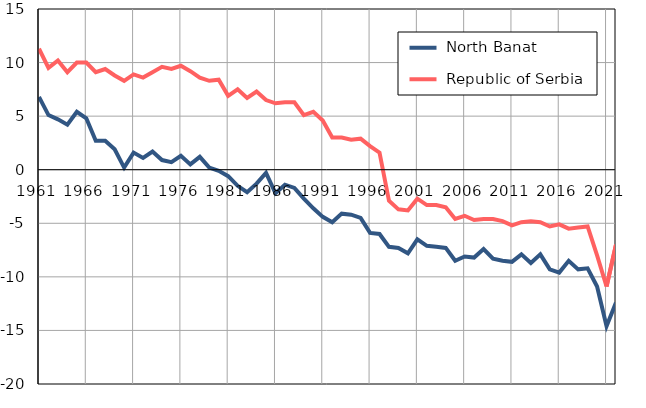
| Category |  North Banat |  Republic of Serbia |
|---|---|---|
| 1961.0 | 6.8 | 11.3 |
| 1962.0 | 5.1 | 9.5 |
| 1963.0 | 4.7 | 10.2 |
| 1964.0 | 4.2 | 9.1 |
| 1965.0 | 5.4 | 10 |
| 1966.0 | 4.8 | 10 |
| 1967.0 | 2.7 | 9.1 |
| 1968.0 | 2.7 | 9.4 |
| 1969.0 | 1.9 | 8.8 |
| 1970.0 | 0.2 | 8.3 |
| 1971.0 | 1.6 | 8.9 |
| 1972.0 | 1.1 | 8.6 |
| 1973.0 | 1.7 | 9.1 |
| 1974.0 | 0.9 | 9.6 |
| 1975.0 | 0.7 | 9.4 |
| 1976.0 | 1.3 | 9.7 |
| 1977.0 | 0.5 | 9.2 |
| 1978.0 | 1.2 | 8.6 |
| 1979.0 | 0.2 | 8.3 |
| 1980.0 | -0.1 | 8.4 |
| 1981.0 | -0.6 | 6.9 |
| 1982.0 | -1.5 | 7.5 |
| 1983.0 | -2.1 | 6.7 |
| 1984.0 | -1.3 | 7.3 |
| 1985.0 | -0.3 | 6.5 |
| 1986.0 | -2.2 | 6.2 |
| 1987.0 | -1.4 | 6.3 |
| 1988.0 | -1.7 | 6.3 |
| 1989.0 | -2.7 | 5.1 |
| 1990.0 | -3.6 | 5.4 |
| 1991.0 | -4.4 | 4.6 |
| 1992.0 | -4.9 | 3 |
| 1993.0 | -4.1 | 3 |
| 1994.0 | -4.2 | 2.8 |
| 1995.0 | -4.5 | 2.9 |
| 1996.0 | -5.9 | 2.2 |
| 1997.0 | -6 | 1.6 |
| 1998.0 | -7.2 | -2.9 |
| 1999.0 | -7.3 | -3.7 |
| 2000.0 | -7.8 | -3.8 |
| 2001.0 | -6.5 | -2.7 |
| 2002.0 | -7.1 | -3.3 |
| 2003.0 | -7.2 | -3.3 |
| 2004.0 | -7.3 | -3.5 |
| 2005.0 | -8.5 | -4.6 |
| 2006.0 | -8.1 | -4.3 |
| 2007.0 | -8.2 | -4.7 |
| 2008.0 | -7.4 | -4.6 |
| 2009.0 | -8.3 | -4.6 |
| 2010.0 | -8.5 | -4.8 |
| 2011.0 | -8.6 | -5.2 |
| 2012.0 | -7.9 | -4.9 |
| 2013.0 | -8.7 | -4.8 |
| 2014.0 | -7.9 | -4.9 |
| 2015.0 | -9.3 | -5.3 |
| 2016.0 | -9.6 | -5.1 |
| 2017.0 | -8.5 | -5.5 |
| 2018.0 | -9.3 | -5.4 |
| 2019.0 | -9.2 | -5.3 |
| 2020.0 | -10.9 | -8 |
| 2021.0 | -14.6 | -10.9 |
| 2022.0 | -12.4 | -7 |